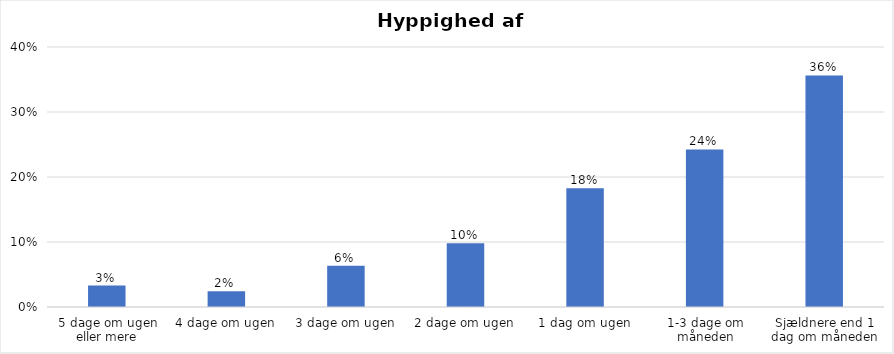
| Category | % |
|---|---|
| 5 dage om ugen eller mere | 0.033 |
| 4 dage om ugen | 0.024 |
| 3 dage om ugen | 0.064 |
| 2 dage om ugen | 0.098 |
| 1 dag om ugen | 0.183 |
| 1-3 dage om måneden | 0.242 |
| Sjældnere end 1 dag om måneden | 0.356 |